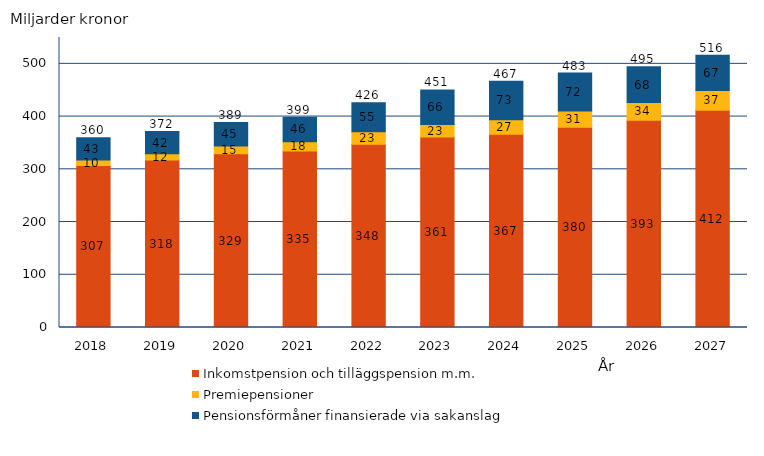
| Category | Inkomstpension och tilläggspension m.m. | Premiepensioner | Pensionsförmåner finansierade via sakanslag | Series 3 |
|---|---|---|---|---|
| 2018.0 | 307.356 | 10.141 | 42.55 | 360.046 |
| 2019.0 | 317.628 | 11.715 | 42.22 | 371.563 |
| 2020.0 | 329.365 | 15.016 | 44.546 | 388.927 |
| 2021.0 | 334.563 | 17.837 | 46.327 | 398.727 |
| 2022.0 | 347.77 | 23.477 | 55.057 | 426.303 |
| 2023.0 | 361.396 | 23.388 | 65.805 | 450.589 |
| 2024.0 | 366.631 | 27.354 | 73.12 | 467.105 |
| 2025.0 | 379.925 | 30.626 | 72.076 | 482.627 |
| 2026.0 | 392.908 | 33.665 | 68.011 | 494.584 |
| 2027.0 | 412.124 | 37.377 | 66.917 | 516.418 |